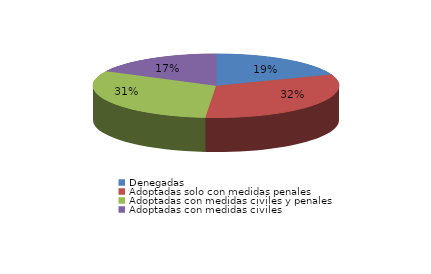
| Category | Series 0 |
|---|---|
| Denegadas | 21 |
| Adoptadas solo con medidas penales | 35 |
| Adoptadas con medidas civiles y penales | 34 |
| Adoptadas con medidas civiles | 19 |